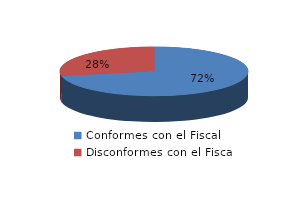
| Category | Series 0 |
|---|---|
| 0 | 23 |
| 1 | 9 |